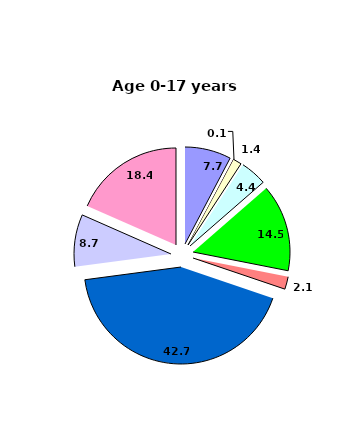
| Category | 0-17 |
|---|---|
| some infectious and parasitic diseases | 7.7 |
| neoplasms | 0.1 |
| endocrin system diseases, malnutrition, metabolism  | 1.4 |
| 
blood and hematogenic organs diseases  | 4.4 |
|  diseases of  the nervous  system and organse of sense | 14.5 |
|  diseases of the circulatory system | 2.1 |
| diseases of the respiratory system  | 42.7 |
|   diseases of the digestive system  | 8.7 |
| other | 18.4 |